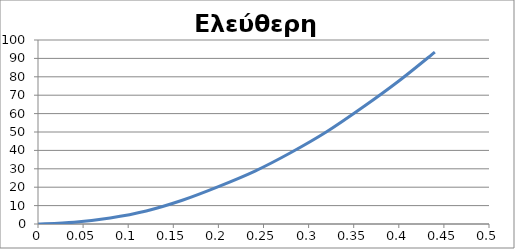
| Category | y |
|---|---|
| 0.0 | 0 |
| 0.04 | 1 |
| 0.08 | 3.3 |
| 0.12 | 7.1 |
| 0.16 | 12.9 |
| 0.2 | 20.3 |
| 0.24 | 28.6 |
| 0.28 | 38.7 |
| 0.32 | 50.1 |
| 0.36 | 63.4 |
| 0.4 | 77.7 |
| 0.44 | 93.4 |